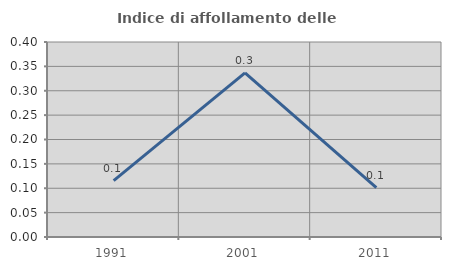
| Category | Indice di affollamento delle abitazioni  |
|---|---|
| 1991.0 | 0.116 |
| 2001.0 | 0.337 |
| 2011.0 | 0.101 |